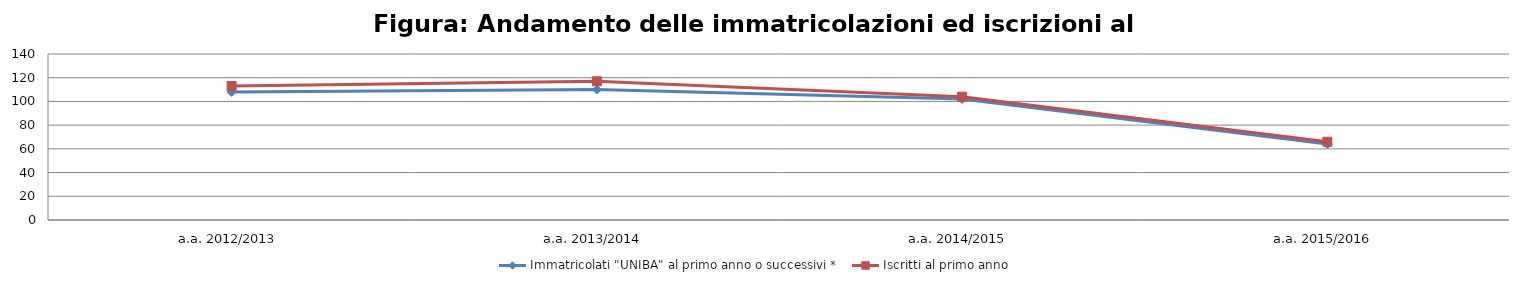
| Category | Immatricolati "UNIBA" al primo anno o successivi * | Iscritti al primo anno  |
|---|---|---|
| a.a. 2012/2013 | 108 | 113 |
| a.a. 2013/2014 | 110 | 117 |
| a.a. 2014/2015 | 102 | 104 |
| a.a. 2015/2016 | 64 | 66 |